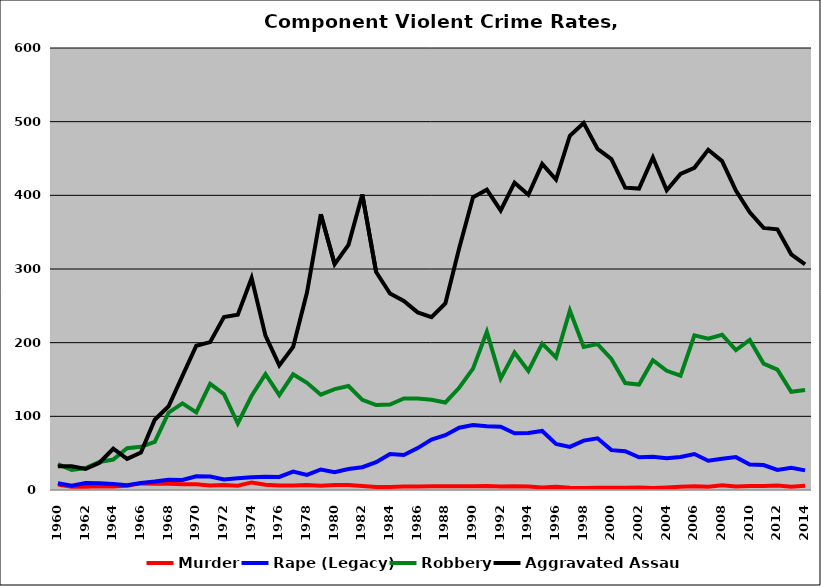
| Category | Murder | Rape (Legacy) | Robbery | Aggravated Assault |
|---|---|---|---|---|
| 1960.0 | 7.394 | 9.187 | 35.179 | 32.266 |
| 1961.0 | 4.367 | 5.895 | 27.074 | 32.096 |
| 1962.0 | 4.264 | 9.382 | 29.851 | 28.571 |
| 1963.0 | 5.042 | 9.034 | 38.025 | 36.975 |
| 1964.0 | 4.684 | 8.147 | 41.344 | 56.008 |
| 1965.0 | 5.743 | 6.535 | 56.634 | 42.178 |
| 1966.0 | 8.984 | 9.57 | 58.594 | 50.781 |
| 1967.0 | 8.588 | 11.45 | 65.458 | 95.42 |
| 1968.0 | 8.427 | 14.045 | 105.056 | 113.67 |
| 1969.0 | 7.963 | 13.704 | 117.593 | 154.815 |
| 1970.0 | 7.663 | 18.61 | 105.454 | 195.766 |
| 1971.0 | 6.093 | 18.28 | 144.086 | 200.717 |
| 1972.0 | 6.903 | 14.159 | 130.088 | 234.867 |
| 1973.0 | 5.903 | 15.799 | 90.278 | 238.021 |
| 1974.0 | 10.297 | 17.277 | 127.923 | 287.609 |
| 1975.0 | 7.254 | 18.135 | 157.168 | 209.499 |
| 1976.0 | 6.186 | 17.698 | 128.694 | 169.072 |
| 1977.0 | 6.014 | 24.914 | 157.045 | 194.158 |
| 1978.0 | 6.69 | 20.412 | 145.455 | 268.096 |
| 1979.0 | 5.67 | 27.835 | 129.381 | 374.399 |
| 1980.0 | 6.893 | 24.211 | 137.026 | 306.669 |
| 1981.0 | 6.689 | 28.428 | 141.137 | 332.776 |
| 1982.0 | 5.316 | 30.897 | 122.425 | 401.163 |
| 1983.0 | 4.125 | 37.789 | 115.347 | 295.875 |
| 1984.0 | 4.078 | 48.94 | 115.987 | 266.721 |
| 1985.0 | 4.823 | 47.588 | 124.277 | 256.592 |
| 1986.0 | 4.897 | 56.872 | 124.171 | 241.074 |
| 1987.0 | 5.124 | 68.478 | 122.516 | 234.627 |
| 1988.0 | 5.152 | 74.394 | 118.788 | 253.333 |
| 1989.0 | 5.052 | 84.547 | 138.782 | 328.083 |
| 1990.0 | 4.954 | 88.116 | 164.823 | 397.347 |
| 1991.0 | 5.441 | 86.471 | 214.706 | 407.647 |
| 1992.0 | 4.644 | 85.776 | 151.234 | 379.536 |
| 1993.0 | 5 | 77 | 186.714 | 417.143 |
| 1994.0 | 4.674 | 77.337 | 161.615 | 400.708 |
| 1995.0 | 3.487 | 80.195 | 198.745 | 442.538 |
| 1996.0 | 4.276 | 62.621 | 179.862 | 421.517 |
| 1997.0 | 3.005 | 58.47 | 243.579 | 480.874 |
| 1998.0 | 2.823 | 67.07 | 194.22 | 498.253 |
| 1999.0 | 3.185 | 70.202 | 197.999 | 463.016 |
| 2000.0 | 3.19 | 54.109 | 177.897 | 449.209 |
| 2001.0 | 2.887 | 52.724 | 145.117 | 410.37 |
| 2002.0 | 3.226 | 44.42 | 143.186 | 409.209 |
| 2003.0 | 2.567 | 45.223 | 176.126 | 451.375 |
| 2004.0 | 3.373 | 43.008 | 161.794 | 406.834 |
| 2005.0 | 4.396 | 44.788 | 155.155 | 429.111 |
| 2006.0 | 4.921 | 48.859 | 209.848 | 437.388 |
| 2007.0 | 4.51 | 39.664 | 205.49 | 461.86 |
| 2008.0 | 6.505 | 42.341 | 210.794 | 446.468 |
| 2009.0 | 4.632 | 44.627 | 189.804 | 406.385 |
| 2010.0 | 5.346 | 34.746 | 203.69 | 377.088 |
| 2011.0 | 5.286 | 33.805 | 171.56 | 355.783 |
| 2012.0 | 6.107 | 27.152 | 163.349 | 353.851 |
| 2013.0 | 4.431 | 30.046 | 133.263 | 319.917 |
| 2014.0 | 5.772 | 26.614 | 135.633 | 306.43 |